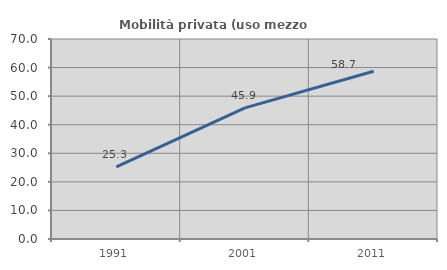
| Category | Mobilità privata (uso mezzo privato) |
|---|---|
| 1991.0 | 25.26 |
| 2001.0 | 45.912 |
| 2011.0 | 58.71 |